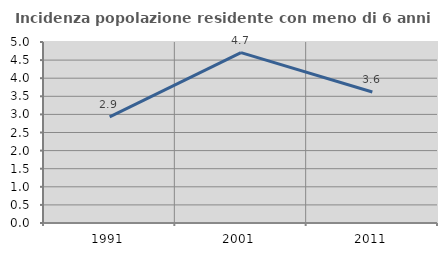
| Category | Incidenza popolazione residente con meno di 6 anni |
|---|---|
| 1991.0 | 2.934 |
| 2001.0 | 4.707 |
| 2011.0 | 3.618 |